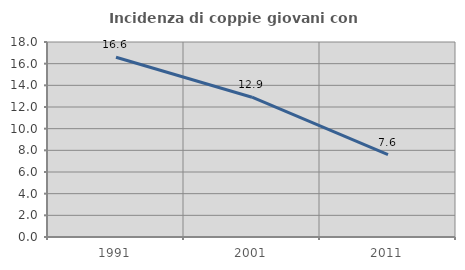
| Category | Incidenza di coppie giovani con figli |
|---|---|
| 1991.0 | 16.594 |
| 2001.0 | 12.904 |
| 2011.0 | 7.614 |